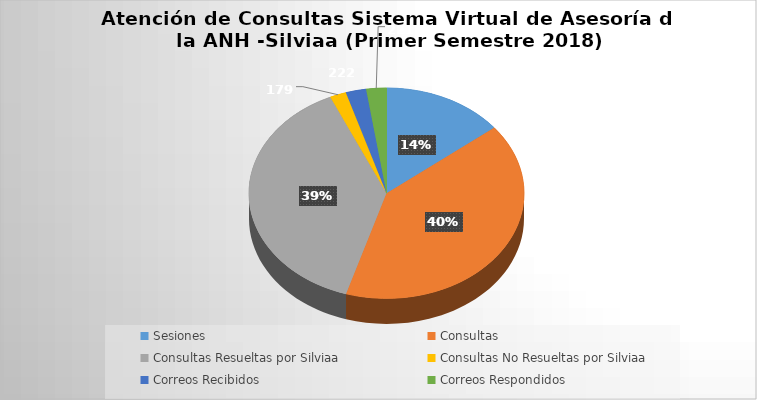
| Category | Total |
|---|---|
| Sesiones | 1328 |
| Consultas | 3759 |
| Consultas Resueltas por Silviaa | 3583 |
| Consultas No Resueltas por Silviaa | 179 |
| Correos Recibidos | 222 |
| Correos Respondidos | 221 |